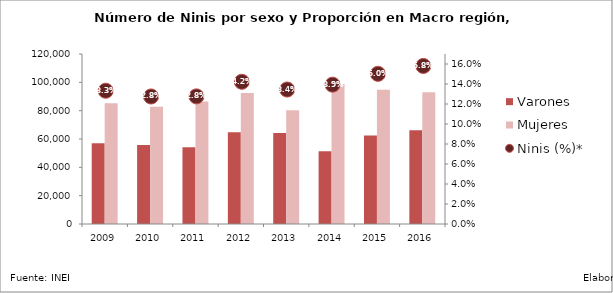
| Category | Varones | Mujeres |
|---|---|---|
| 2009.0 | 57044.74 | 85235.71 |
| 2010.0 | 55703.48 | 82767.79 |
| 2011.0 | 54188.43 | 86529.9 |
| 2012.0 | 64827.45 | 92478.02 |
| 2013.0 | 64205.34 | 80220.91 |
| 2014.0 | 51418.66 | 98911.01 |
| 2015.0 | 62437.6 | 94691.24 |
| 2016.0 | 66135.37 | 92922.37 |